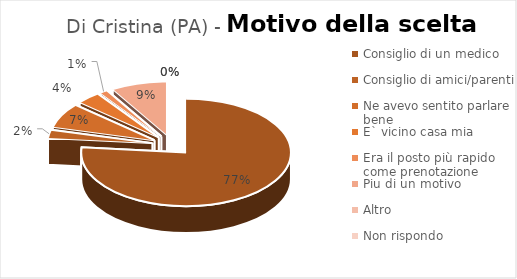
| Category | Amb Osp Dei Bambini G. Di Cristina (PA) |
|---|---|
| Consiglio di un medico | 0.765 |
| Consiglio di amici/parenti | 0.025 |
| Ne avevo sentito parlare bene | 0.074 |
| E` vicino casa mia | 0.037 |
| Era il posto più rapido come prenotazione | 0.012 |
| Piu di un motivo | 0.086 |
| Altro | 0 |
| Non rispondo | 0 |